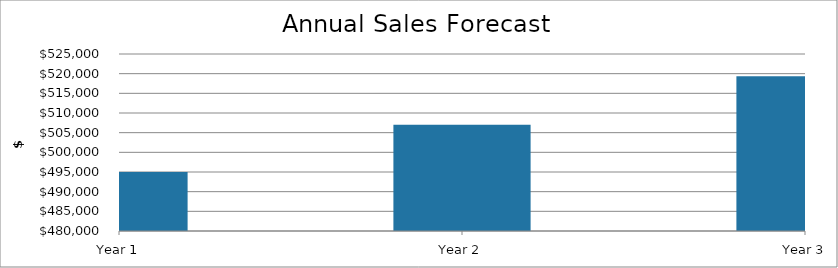
| Category | Total Sales |
|---|---|
| Year 1 | 495024.395 |
| Year 2 | 507042.614 |
| Year 3 | 519352.613 |